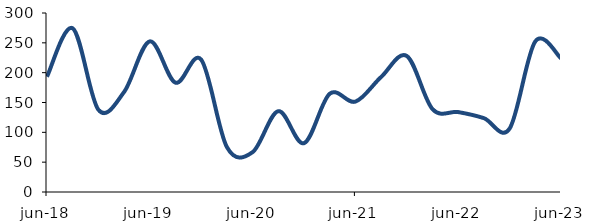
| Category | Series 0 |
|---|---|
| 2018-06-01 | 193.288 |
| 2018-09-01 | 274.313 |
| 2018-12-01 | 137.831 |
| 2019-03-01 | 167.685 |
| 2019-06-01 | 252.431 |
| 2019-09-01 | 183.231 |
| 2019-12-01 | 221.83 |
| 2020-03-01 | 75.311 |
| 2020-06-01 | 66.785 |
| 2020-09-01 | 135.476 |
| 2020-12-01 | 81.806 |
| 2021-03-01 | 164.633 |
| 2021-06-01 | 151.498 |
| 2021-09-01 | 192.731 |
| 2021-12-01 | 227.965 |
| 2022-03-01 | 138.904 |
| 2022-06-01 | 133.966 |
| 2022-09-01 | 123.763 |
| 2022-12-01 | 106.238 |
| 2023-03-01 | 252.422 |
| 2023-06-01 | 224.044 |